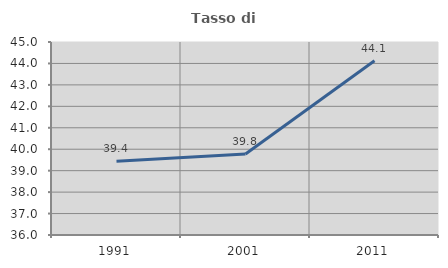
| Category | Tasso di occupazione   |
|---|---|
| 1991.0 | 39.442 |
| 2001.0 | 39.777 |
| 2011.0 | 44.125 |